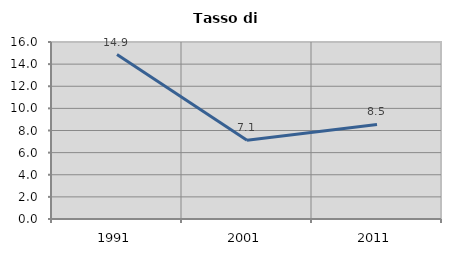
| Category | Tasso di disoccupazione   |
|---|---|
| 1991.0 | 14.861 |
| 2001.0 | 7.115 |
| 2011.0 | 8.549 |